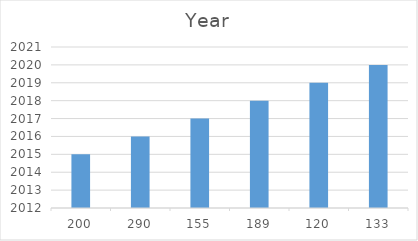
| Category | Year |
|---|---|
| 200.0 | 2015 |
| 290.0 | 2016 |
| 155.0 | 2017 |
| 189.0 | 2018 |
| 120.0 | 2019 |
| 133.0 | 2020 |